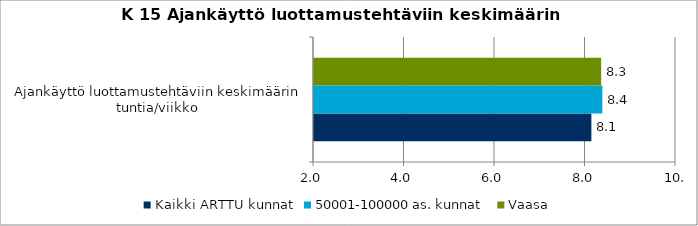
| Category | Kaikki ARTTU kunnat | 50001-100000 as. kunnat | Vaasa |
|---|---|---|---|
| Ajankäyttö luottamustehtäviin keskimäärin tuntia/viikko | 8.13 | 8.372 | 8.346 |